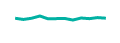
| Category | Series 0 |
|---|---|
| 0 | 1900-01-01 18:00:23 |
| 1 | 1900-01-01 12:10:34 |
| 2 | 1900-01-01 18:00:15 |
| 3 | 1900-01-02 04:44:12 |
| 4 | 1900-01-01 15:10:34 |
| 5 | 1900-01-01 16:10:34 |
| 6 | 1900-01-01 17:10:34 |
| 7 | 1900-01-01 09:23:58 |
| 8 | 1900-01-01 19:10:34 |
| 9 | 1900-01-01 16:00:33 |
| 10 | 1900-01-01 21:10:34 |
| 11 | 1900-01-01 18:10:23 |